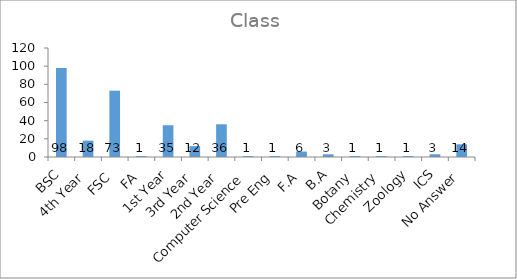
| Category | Class |
|---|---|
| BSC | 98 |
| 4th Year | 18 |
| FSC | 73 |
| FA | 1 |
| 1st Year | 35 |
| 3rd Year | 12 |
| 2nd Year | 36 |
| Computer Science | 1 |
| Pre Eng | 1 |
| F.A | 6 |
| B.A | 3 |
| Botany | 1 |
| Chemistry | 1 |
| Zoology | 1 |
| ICS | 3 |
| No Answer | 14 |